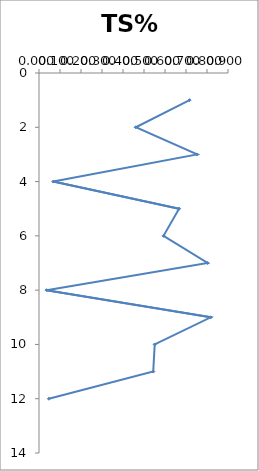
| Category | TS% |
|---|---|
| 0.717 | 1 |
| 0.461 | 2 |
| 0.753 | 3 |
| 0.068 | 4 |
| 0.667 | 5 |
| 0.593 | 6 |
| 0.803 | 7 |
| 0.036 | 8 |
| 0.818 | 9 |
| 0.551 | 10 |
| 0.544 | 11 |
| 0.047 | 12 |